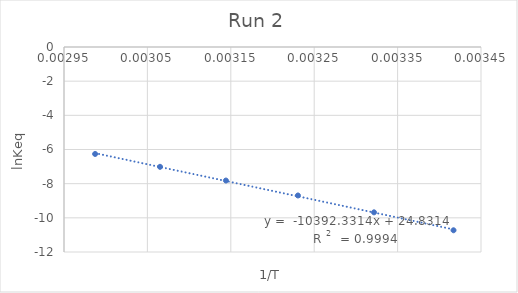
| Category | Series 0 |
|---|---|
| 0.0034170510849137197 | -10.727 |
| 0.0033217073575817976 | -9.678 |
| 0.003230495881117752 | -8.691 |
| 0.003144159723313945 | -7.817 |
| 0.0030651340996168583 | -7.014 |
| 0.002987303958177745 | -6.262 |